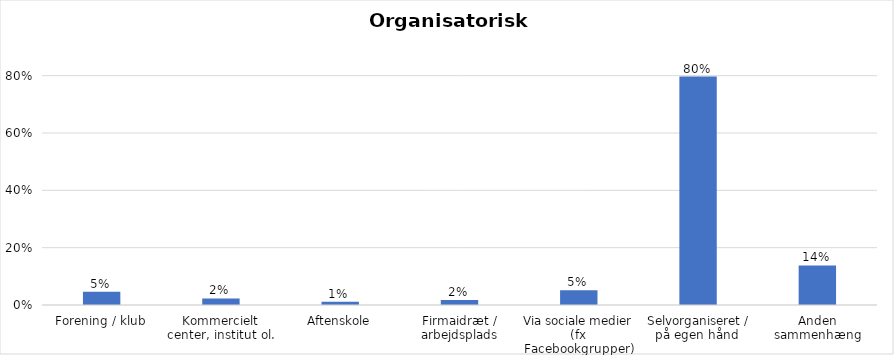
| Category | % |
|---|---|
| Forening / klub | 0.046 |
| Kommercielt center, institut ol. | 0.023 |
| Aftenskole | 0.011 |
| Firmaidræt / arbejdsplads | 0.017 |
| Via sociale medier (fx Facebookgrupper) | 0.052 |
| Selvorganiseret / på egen hånd  | 0.797 |
| Anden sammenhæng | 0.138 |